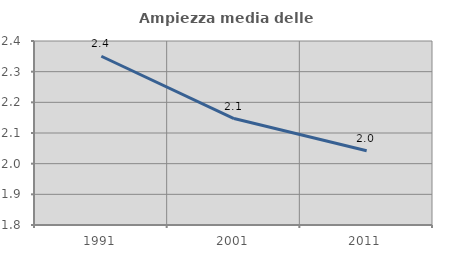
| Category | Ampiezza media delle famiglie |
|---|---|
| 1991.0 | 2.35 |
| 2001.0 | 2.147 |
| 2011.0 | 2.042 |